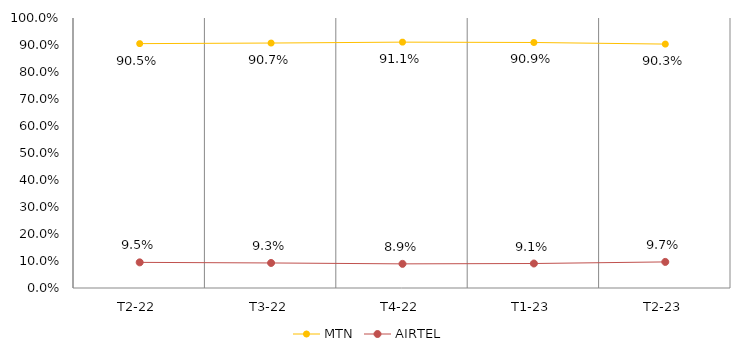
| Category | MTN | AIRTEL |
|---|---|---|
| T2-22 | 0.905 | 0.095 |
| T3-22 | 0.907 | 0.093 |
| T4-22 | 0.911 | 0.089 |
| T1-23 | 0.909 | 0.091 |
| T2-23 | 0.903 | 0.097 |